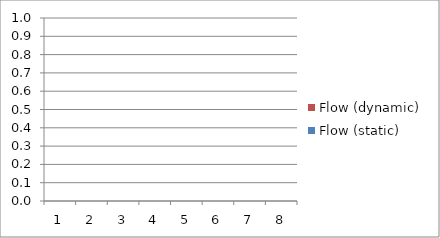
| Category | Flow (dynamic) | Flow (static) |
|---|---|---|
| 1.0 | 0 | 0 |
| 2.0 | 0 | 0 |
| 3.0 | 0 | 0 |
| 4.0 | 0 | 0 |
| 5.0 | 0 | 0 |
| 6.0 | 0 | 0 |
| 7.0 | 0 | 0 |
| 8.0 | 0 | 0 |